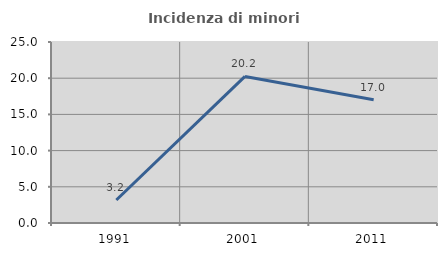
| Category | Incidenza di minori stranieri |
|---|---|
| 1991.0 | 3.175 |
| 2001.0 | 20.245 |
| 2011.0 | 17.033 |